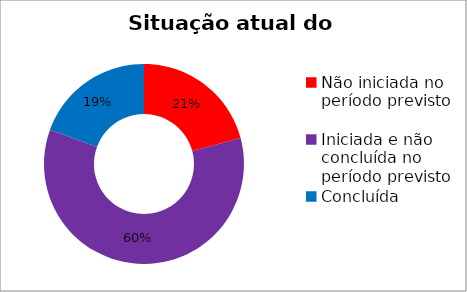
| Category | Series 0 |
|---|---|
| Não iniciada no período previsto | 0.208 |
| Iniciada e não concluída no período previsto | 0.597 |
| Concluída | 0.194 |